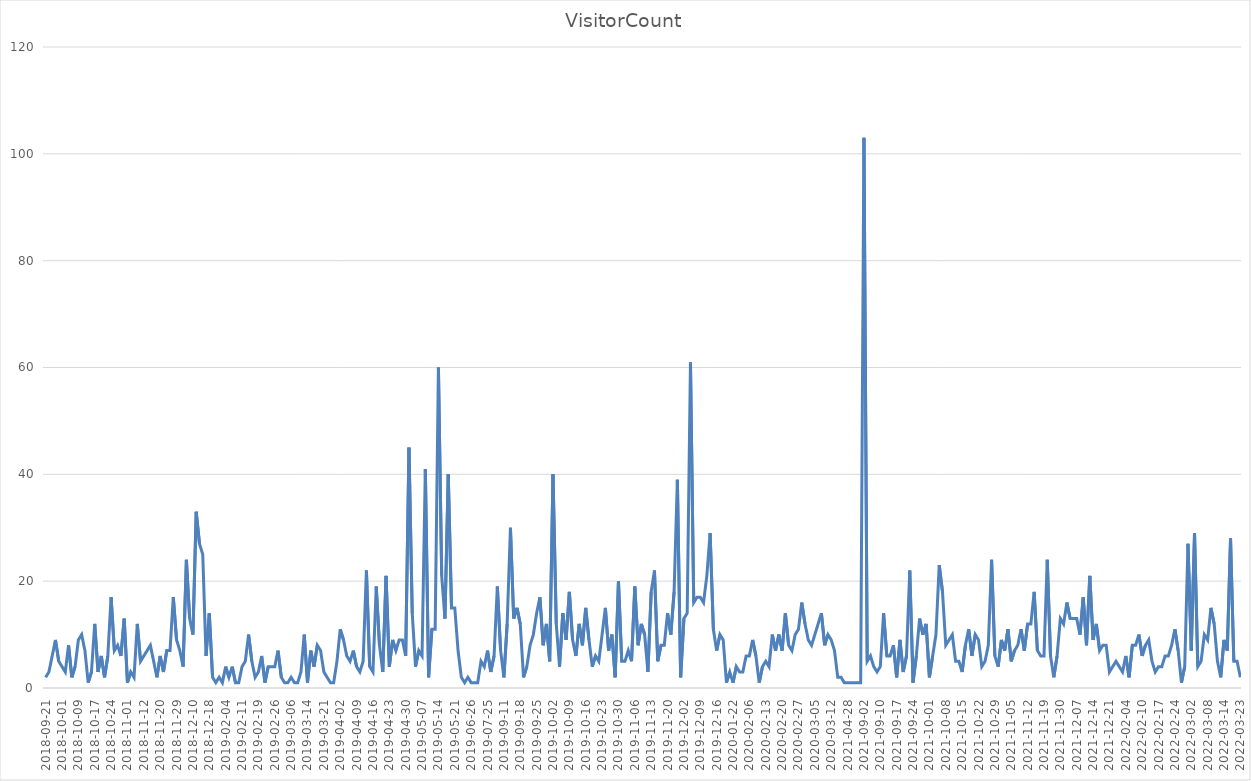
| Category | VisitorCount |
|---|---|
| 2018-09-21 | 2 |
| 2018-09-24 | 3 |
| 2018-09-25 | 6 |
| 2018-09-26 | 9 |
| 2018-09-27 | 5 |
| 2018-10-01 | 4 |
| 2018-10-02 | 3 |
| 2018-10-03 | 8 |
| 2018-10-04 | 2 |
| 2018-10-08 | 4 |
| 2018-10-09 | 9 |
| 2018-10-10 | 10 |
| 2018-10-11 | 7 |
| 2018-10-15 | 1 |
| 2018-10-16 | 3 |
| 2018-10-17 | 12 |
| 2018-10-18 | 3 |
| 2018-10-19 | 6 |
| 2018-10-22 | 2 |
| 2018-10-23 | 6 |
| 2018-10-24 | 17 |
| 2018-10-25 | 7 |
| 2018-10-29 | 8 |
| 2018-10-30 | 6 |
| 2018-10-31 | 13 |
| 2018-11-01 | 1 |
| 2018-11-05 | 3 |
| 2018-11-06 | 2 |
| 2018-11-07 | 12 |
| 2018-11-08 | 5 |
| 2018-11-12 | 6 |
| 2018-11-13 | 7 |
| 2018-11-14 | 8 |
| 2018-11-15 | 5 |
| 2018-11-19 | 2 |
| 2018-11-20 | 6 |
| 2018-11-21 | 3 |
| 2018-11-26 | 7 |
| 2018-11-27 | 7 |
| 2018-11-28 | 17 |
| 2018-11-29 | 9 |
| 2018-12-03 | 7 |
| 2018-12-04 | 4 |
| 2018-12-05 | 24 |
| 2018-12-06 | 13 |
| 2018-12-10 | 10 |
| 2018-12-11 | 33 |
| 2018-12-12 | 27 |
| 2018-12-13 | 25 |
| 2018-12-17 | 6 |
| 2018-12-18 | 14 |
| 2019-01-16 | 2 |
| 2019-01-17 | 1 |
| 2019-01-23 | 2 |
| 2019-01-24 | 1 |
| 2019-02-04 | 4 |
| 2019-02-05 | 2 |
| 2019-02-06 | 4 |
| 2019-02-07 | 1 |
| 2019-02-08 | 1 |
| 2019-02-11 | 4 |
| 2019-02-12 | 5 |
| 2019-02-13 | 10 |
| 2019-02-14 | 5 |
| 2019-02-15 | 2 |
| 2019-02-19 | 3 |
| 2019-02-20 | 6 |
| 2019-02-21 | 1 |
| 2019-02-22 | 4 |
| 2019-02-25 | 4 |
| 2019-02-26 | 4 |
| 2019-02-27 | 7 |
| 2019-02-28 | 2 |
| 2019-03-01 | 1 |
| 2019-03-05 | 1 |
| 2019-03-06 | 2 |
| 2019-03-07 | 1 |
| 2019-03-08 | 1 |
| 2019-03-11 | 3 |
| 2019-03-13 | 10 |
| 2019-03-14 | 1 |
| 2019-03-15 | 7 |
| 2019-03-18 | 4 |
| 2019-03-19 | 8 |
| 2019-03-20 | 7 |
| 2019-03-21 | 3 |
| 2019-03-26 | 2 |
| 2019-03-28 | 1 |
| 2019-03-29 | 1 |
| 2019-04-01 | 5 |
| 2019-04-02 | 11 |
| 2019-04-03 | 9 |
| 2019-04-04 | 6 |
| 2019-04-05 | 5 |
| 2019-04-08 | 7 |
| 2019-04-09 | 4 |
| 2019-04-10 | 3 |
| 2019-04-11 | 5 |
| 2019-04-12 | 22 |
| 2019-04-15 | 4 |
| 2019-04-16 | 3 |
| 2019-04-17 | 19 |
| 2019-04-18 | 8 |
| 2019-04-19 | 3 |
| 2019-04-22 | 21 |
| 2019-04-23 | 4 |
| 2019-04-24 | 9 |
| 2019-04-25 | 7 |
| 2019-04-26 | 9 |
| 2019-04-29 | 9 |
| 2019-04-30 | 6 |
| 2019-05-01 | 45 |
| 2019-05-02 | 14 |
| 2019-05-03 | 4 |
| 2019-05-06 | 7 |
| 2019-05-07 | 6 |
| 2019-05-08 | 41 |
| 2019-05-09 | 2 |
| 2019-05-10 | 11 |
| 2019-05-13 | 11 |
| 2019-05-14 | 60 |
| 2019-05-15 | 21 |
| 2019-05-16 | 13 |
| 2019-05-17 | 40 |
| 2019-05-20 | 15 |
| 2019-05-21 | 15 |
| 2019-05-22 | 7 |
| 2019-05-23 | 2 |
| 2019-05-30 | 1 |
| 2019-06-12 | 2 |
| 2019-06-26 | 1 |
| 2019-07-10 | 1 |
| 2019-07-22 | 1 |
| 2019-07-23 | 5 |
| 2019-07-24 | 4 |
| 2019-07-25 | 7 |
| 2019-09-04 | 3 |
| 2019-09-06 | 6 |
| 2019-09-09 | 19 |
| 2019-09-10 | 7 |
| 2019-09-11 | 2 |
| 2019-09-12 | 12 |
| 2019-09-13 | 30 |
| 2019-09-16 | 13 |
| 2019-09-17 | 15 |
| 2019-09-18 | 12 |
| 2019-09-19 | 2 |
| 2019-09-20 | 4 |
| 2019-09-23 | 8 |
| 2019-09-24 | 10 |
| 2019-09-25 | 14 |
| 2019-09-26 | 17 |
| 2019-09-27 | 8 |
| 2019-09-30 | 12 |
| 2019-10-01 | 5 |
| 2019-10-02 | 40 |
| 2019-10-03 | 12 |
| 2019-10-04 | 4 |
| 2019-10-07 | 14 |
| 2019-10-08 | 9 |
| 2019-10-09 | 18 |
| 2019-10-10 | 9 |
| 2019-10-11 | 6 |
| 2019-10-14 | 12 |
| 2019-10-15 | 8 |
| 2019-10-16 | 15 |
| 2019-10-17 | 9 |
| 2019-10-18 | 4 |
| 2019-10-21 | 6 |
| 2019-10-22 | 5 |
| 2019-10-23 | 10 |
| 2019-10-24 | 15 |
| 2019-10-25 | 7 |
| 2019-10-28 | 10 |
| 2019-10-29 | 2 |
| 2019-10-30 | 20 |
| 2019-10-31 | 5 |
| 2019-11-01 | 5 |
| 2019-11-04 | 7 |
| 2019-11-05 | 5 |
| 2019-11-06 | 19 |
| 2019-11-07 | 8 |
| 2019-11-08 | 12 |
| 2019-11-11 | 10 |
| 2019-11-12 | 3 |
| 2019-11-13 | 18 |
| 2019-11-14 | 22 |
| 2019-11-15 | 5 |
| 2019-11-18 | 8 |
| 2019-11-19 | 8 |
| 2019-11-20 | 14 |
| 2019-11-21 | 10 |
| 2019-11-22 | 18 |
| 2019-11-25 | 39 |
| 2019-11-26 | 2 |
| 2019-12-02 | 13 |
| 2019-12-03 | 14 |
| 2019-12-04 | 61 |
| 2019-12-05 | 16 |
| 2019-12-06 | 17 |
| 2019-12-09 | 17 |
| 2019-12-10 | 16 |
| 2019-12-11 | 21 |
| 2019-12-12 | 29 |
| 2019-12-13 | 11 |
| 2019-12-16 | 7 |
| 2019-12-17 | 10 |
| 2019-12-18 | 9 |
| 2020-01-09 | 1 |
| 2020-01-16 | 3 |
| 2020-01-22 | 1 |
| 2020-01-23 | 4 |
| 2020-02-03 | 3 |
| 2020-02-04 | 3 |
| 2020-02-05 | 6 |
| 2020-02-06 | 6 |
| 2020-02-07 | 9 |
| 2020-02-10 | 6 |
| 2020-02-11 | 1 |
| 2020-02-12 | 4 |
| 2020-02-13 | 5 |
| 2020-02-14 | 4 |
| 2020-02-17 | 10 |
| 2020-02-18 | 7 |
| 2020-02-19 | 10 |
| 2020-02-20 | 7 |
| 2020-02-21 | 14 |
| 2020-02-24 | 8 |
| 2020-02-25 | 7 |
| 2020-02-26 | 10 |
| 2020-02-27 | 11 |
| 2020-02-28 | 16 |
| 2020-03-02 | 12 |
| 2020-03-03 | 9 |
| 2020-03-04 | 8 |
| 2020-03-05 | 10 |
| 2020-03-06 | 12 |
| 2020-03-09 | 14 |
| 2020-03-10 | 8 |
| 2020-03-11 | 10 |
| 2020-03-12 | 9 |
| 2020-03-13 | 7 |
| 2021-03-25 | 2 |
| 2021-04-22 | 2 |
| 2021-04-23 | 1 |
| 2021-04-28 | 1 |
| 2021-05-03 | 1 |
| 2021-05-07 | 1 |
| 2021-05-13 | 1 |
| 2021-07-16 | 1 |
| 2021-09-02 | 103 |
| 2021-09-03 | 5 |
| 2021-09-07 | 6 |
| 2021-09-08 | 4 |
| 2021-09-09 | 3 |
| 2021-09-10 | 4 |
| 2021-09-13 | 14 |
| 2021-09-14 | 6 |
| 2021-09-15 | 6 |
| 2021-09-16 | 8 |
| 2021-09-17 | 2 |
| 2021-09-20 | 9 |
| 2021-09-21 | 3 |
| 2021-09-22 | 6 |
| 2021-09-23 | 22 |
| 2021-09-24 | 1 |
| 2021-09-27 | 6 |
| 2021-09-28 | 13 |
| 2021-09-29 | 10 |
| 2021-09-30 | 12 |
| 2021-10-01 | 2 |
| 2021-10-04 | 6 |
| 2021-10-05 | 10 |
| 2021-10-06 | 23 |
| 2021-10-07 | 18 |
| 2021-10-08 | 8 |
| 2021-10-11 | 9 |
| 2021-10-12 | 10 |
| 2021-10-13 | 5 |
| 2021-10-14 | 5 |
| 2021-10-15 | 3 |
| 2021-10-18 | 8 |
| 2021-10-19 | 11 |
| 2021-10-20 | 6 |
| 2021-10-21 | 10 |
| 2021-10-22 | 9 |
| 2021-10-25 | 4 |
| 2021-10-26 | 5 |
| 2021-10-27 | 8 |
| 2021-10-28 | 24 |
| 2021-10-29 | 6 |
| 2021-11-01 | 4 |
| 2021-11-02 | 9 |
| 2021-11-03 | 7 |
| 2021-11-04 | 11 |
| 2021-11-05 | 5 |
| 2021-11-08 | 7 |
| 2021-11-09 | 8 |
| 2021-11-10 | 11 |
| 2021-11-11 | 7 |
| 2021-11-12 | 12 |
| 2021-11-15 | 12 |
| 2021-11-16 | 18 |
| 2021-11-17 | 7 |
| 2021-11-18 | 6 |
| 2021-11-19 | 6 |
| 2021-11-22 | 24 |
| 2021-11-23 | 6 |
| 2021-11-24 | 2 |
| 2021-11-29 | 6 |
| 2021-11-30 | 13 |
| 2021-12-01 | 12 |
| 2021-12-02 | 16 |
| 2021-12-03 | 13 |
| 2021-12-06 | 13 |
| 2021-12-07 | 13 |
| 2021-12-08 | 10 |
| 2021-12-09 | 17 |
| 2021-12-10 | 8 |
| 2021-12-13 | 21 |
| 2021-12-14 | 9 |
| 2021-12-15 | 12 |
| 2021-12-16 | 7 |
| 2021-12-17 | 8 |
| 2021-12-20 | 8 |
| 2021-12-21 | 3 |
| 2022-01-31 | 4 |
| 2022-02-01 | 5 |
| 2022-02-02 | 4 |
| 2022-02-03 | 3 |
| 2022-02-04 | 6 |
| 2022-02-06 | 2 |
| 2022-02-07 | 8 |
| 2022-02-08 | 8 |
| 2022-02-09 | 10 |
| 2022-02-10 | 6 |
| 2022-02-11 | 8 |
| 2022-02-14 | 9 |
| 2022-02-15 | 5 |
| 2022-02-16 | 3 |
| 2022-02-17 | 4 |
| 2022-02-18 | 4 |
| 2022-02-21 | 6 |
| 2022-02-22 | 6 |
| 2022-02-23 | 8 |
| 2022-02-24 | 11 |
| 2022-02-25 | 7 |
| 2022-02-27 | 1 |
| 2022-02-28 | 4 |
| 2022-03-01 | 27 |
| 2022-03-02 | 7 |
| 2022-03-03 | 29 |
| 2022-03-04 | 4 |
| 2022-03-06 | 5 |
| 2022-03-07 | 10 |
| 2022-03-08 | 9 |
| 2022-03-09 | 15 |
| 2022-03-10 | 12 |
| 2022-03-11 | 5 |
| 2022-03-13 | 2 |
| 2022-03-14 | 9 |
| 2022-03-15 | 7 |
| 2022-03-16 | 28 |
| 2022-03-17 | 5 |
| 2022-03-18 | 5 |
| 2022-03-23 | 2 |